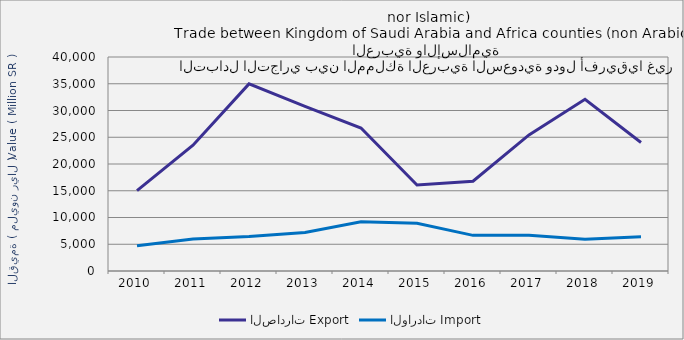
| Category | الصادرات | الواردات |
|---|---|---|
| 2010.0 | 15013169940 | 4706256055 |
| 2011.0 | 23524019509 | 5985787992 |
| 2012.0 | 34973824101 | 6446689147 |
| 2013.0 | 30758464509 | 7215889024 |
| 2014.0 | 26725079028 | 9215043999 |
| 2015.0 | 16073042059 | 8929444542 |
| 2016.0 | 16777216326 | 6663097393 |
| 2017.0 | 25444314088 | 6667956926 |
| 2018.0 | 32102662185 | 5945455305 |
| 2019.0 | 24024172547 | 6398440606 |